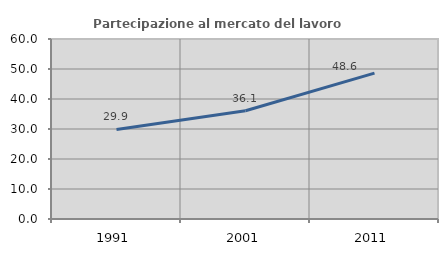
| Category | Partecipazione al mercato del lavoro  femminile |
|---|---|
| 1991.0 | 29.861 |
| 2001.0 | 36.095 |
| 2011.0 | 48.619 |